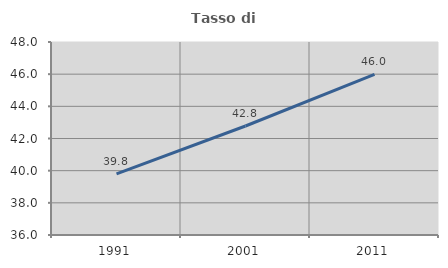
| Category | Tasso di occupazione   |
|---|---|
| 1991.0 | 39.801 |
| 2001.0 | 42.778 |
| 2011.0 | 45.99 |